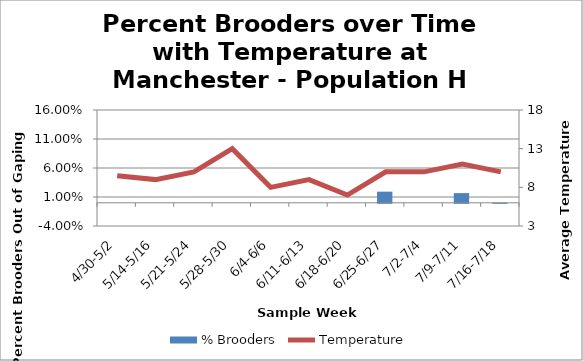
| Category | % Brooders |
|---|---|
| 4/30-5/2 | 0 |
| 5/14-5/16 | 0 |
| 5/21-5/24 | 0 |
| 5/28-5/30 | 0 |
| 6/4-6/6 | 0 |
| 6/11-6/13 | 0 |
| 6/18-6/20 | 0 |
| 6/25-6/27 | 0.019 |
| 7/2-7/4 | 0 |
| 7/9-7/11 | 0.017 |
| 7/16-7/18 | 0 |